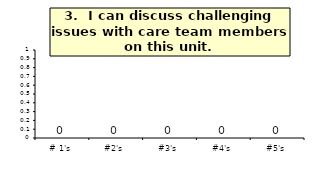
| Category | Q_3 |
|---|---|
| # 1's | 0 |
| #2's | 0 |
| #3's | 0 |
| #4's | 0 |
| #5's | 0 |